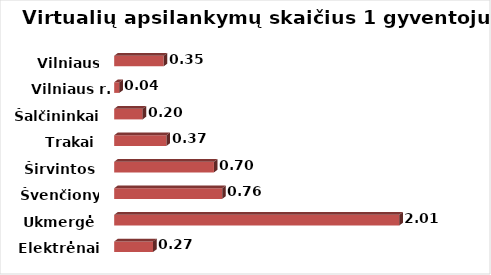
| Category | Series 0 |
|---|---|
| Elektrėnai | 0.273 |
| Ukmergė | 2.005 |
| Švenčionys | 0.759 |
| Širvintos | 0.701 |
| Trakai | 0.368 |
| Šalčininkai | 0.2 |
| Vilniaus r. | 0.036 |
| Vilniaus m. | 0.348 |